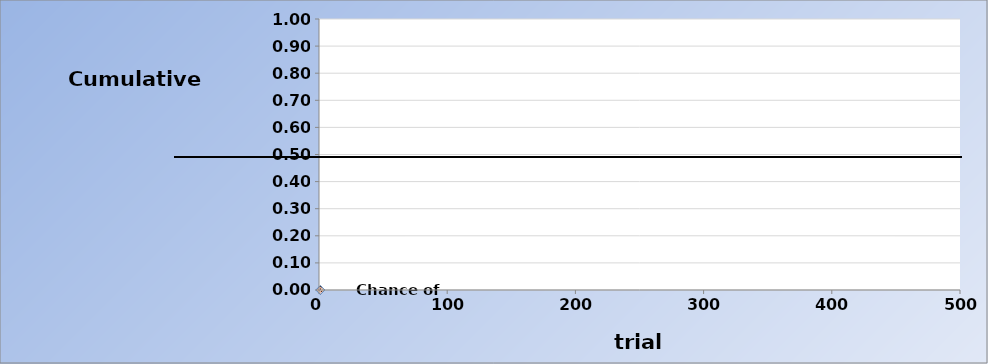
| Category | Series 0 |
|---|---|
| 1.0 | 0 |